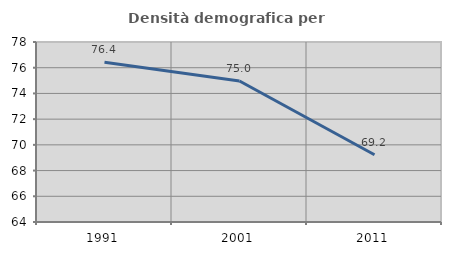
| Category | Densità demografica |
|---|---|
| 1991.0 | 76.427 |
| 2001.0 | 74.965 |
| 2011.0 | 69.229 |